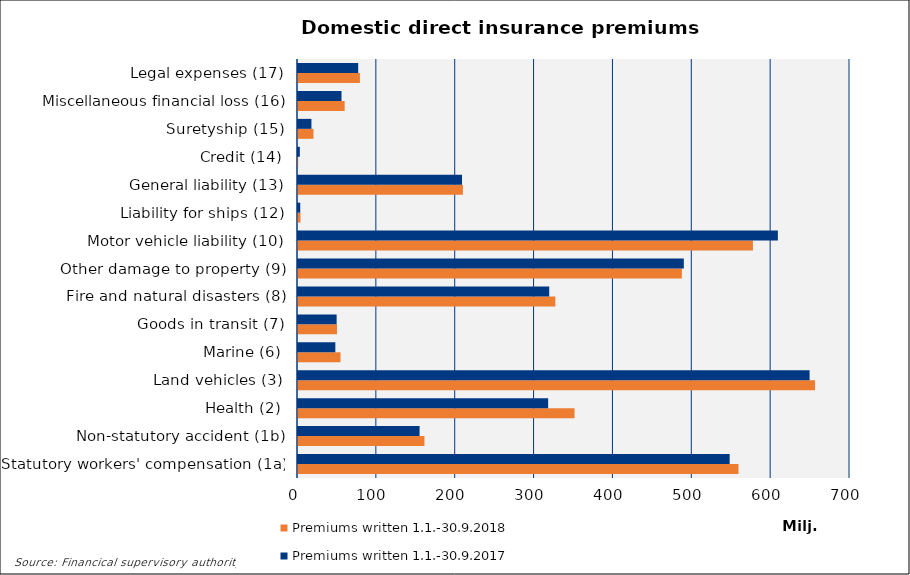
| Category | Premiums written |
|---|---|
| Statutory workers' compensation (1a) | 547402.07 |
| Non-statutory accident (1b) | 154166.375 |
| Health (2) | 317214.574 |
| Land vehicles (3) | 648767.502 |
| Marine (6) | 47343.236 |
| Goods in transit (7) | 48993.336 |
| Fire and natural disasters (8) | 318572.352 |
| Other damage to property (9) | 489264.942 |
| Motor vehicle liability (10) | 608528.345 |
| Liability for ships (12) | 2837.072 |
| General liability (13) | 208009.585 |
| Credit (14) | 2320.877 |
| Suretyship (15) | 17025.706 |
| Miscellaneous financial loss (16) | 55174.175 |
| Legal expenses (17) | 76330.184 |